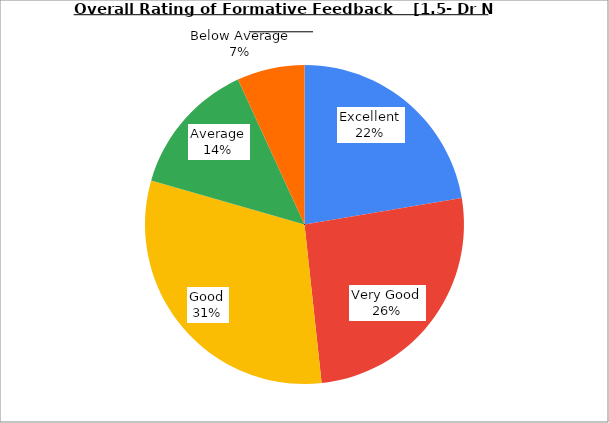
| Category | Series 0 |
|---|---|
| Excellent | 22.342 |
| Very Good | 25.946 |
| Good | 31.171 |
| Average | 13.694 |
| Below Average | 6.847 |